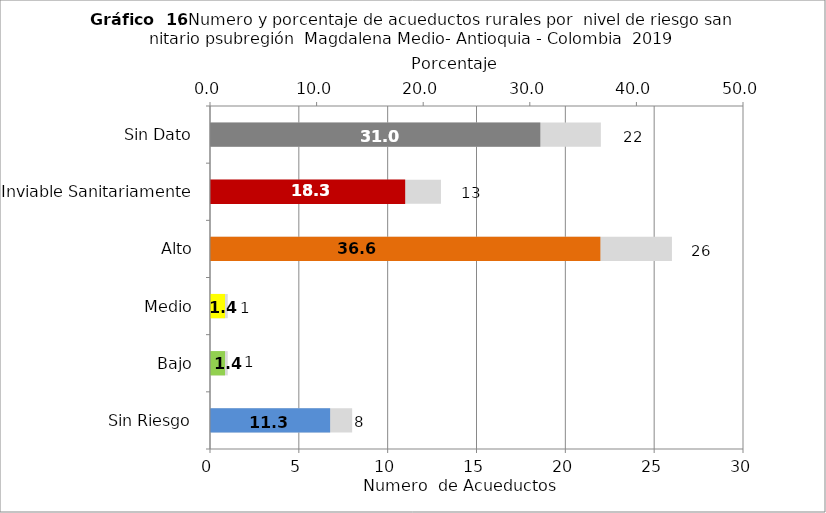
| Category | Número de Sistemas |
|---|---|
| Sin Riesgo | 8 |
| Bajo | 1 |
| Medio | 1 |
| Alto | 26 |
| Inviable Sanitariamente | 13 |
| Sin Dato | 22 |